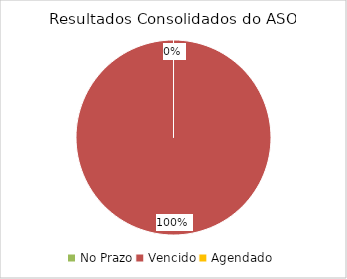
| Category | Total |
|---|---|
| No Prazo | 0 |
| Vencido | 1 |
| Agendado | 0 |